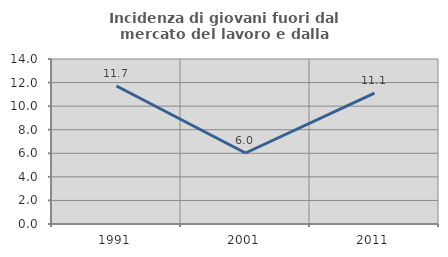
| Category | Incidenza di giovani fuori dal mercato del lavoro e dalla formazione  |
|---|---|
| 1991.0 | 11.712 |
| 2001.0 | 6.024 |
| 2011.0 | 11.111 |